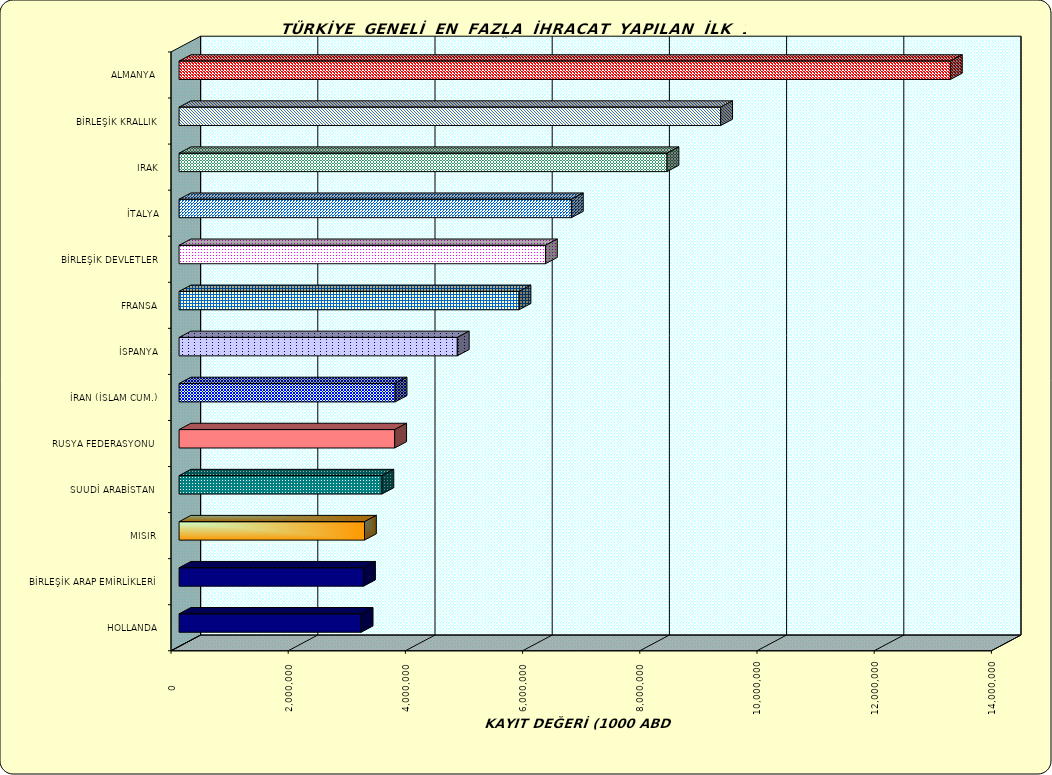
| Category | Series 0 |
|---|---|
| ALMANYA  | 13163067.178 |
| BİRLEŞİK KRALLIK | 9242791.279 |
| IRAK | 8326470.959 |
| İTALYA | 6694988.32 |
| BİRLEŞİK DEVLETLER | 6252527.053 |
| FRANSA | 5801356.813 |
| İSPANYA | 4747899.745 |
| İRAN (İSLAM CUM.) | 3687082.418 |
| RUSYA FEDERASYONU  | 3679739.239 |
| SUUDİ ARABİSTAN  | 3461595.191 |
| MISIR  | 3164262.593 |
| BİRLEŞİK ARAP EMİRLİKLERİ | 3147985.784 |
| HOLLANDA | 3107642.963 |